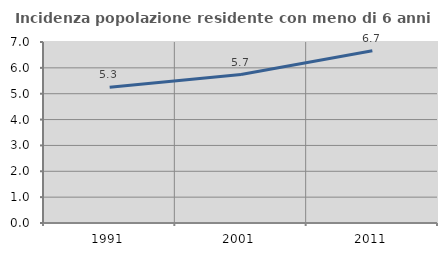
| Category | Incidenza popolazione residente con meno di 6 anni |
|---|---|
| 1991.0 | 5.251 |
| 2001.0 | 5.743 |
| 2011.0 | 6.661 |